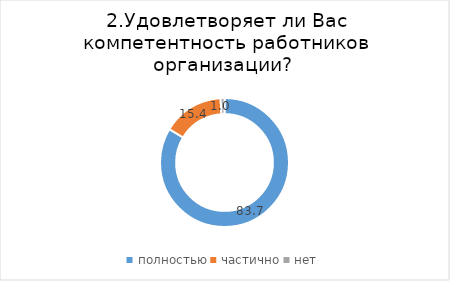
| Category | Series 0 |
|---|---|
| полностью | 83.66 |
| частично | 15.359 |
| нет | 0.98 |